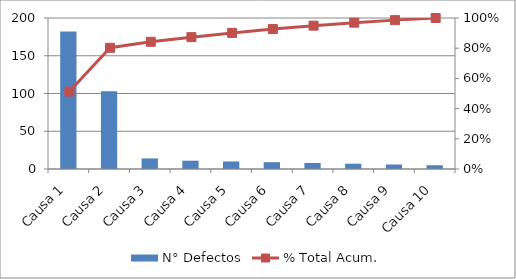
| Category | N° Defectos |
|---|---|
| Causa 1 | 182 |
| Causa 2 | 103 |
| Causa 3 | 14 |
| Causa 4 | 11 |
| Causa 5 | 10 |
| Causa 6 | 9 |
| Causa 7 | 8 |
| Causa 8 | 7 |
| Causa 9 | 6 |
| Causa 10 | 5 |